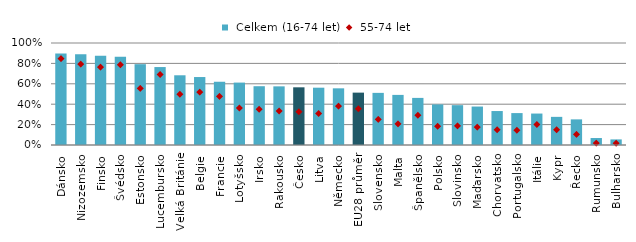
| Category |  Celkem (16-74 let) |
|---|---|
| Dánsko | 0.898 |
| Nizozemsko | 0.889 |
| Finsko | 0.874 |
| Švédsko | 0.865 |
| Estonsko | 0.792 |
| Lucembursko | 0.764 |
| Velká Británie | 0.684 |
| Belgie | 0.666 |
| Francie | 0.62 |
| Lotyšsko | 0.612 |
| Irsko | 0.576 |
| Rakousko | 0.575 |
| Česko | 0.566 |
| Litva | 0.562 |
| Německo | 0.556 |
| EU28 průměr | 0.513 |
| Slovensko | 0.511 |
| Malta | 0.491 |
| Španělsko | 0.462 |
| Polsko | 0.398 |
| Slovinsko | 0.391 |
| Maďarsko | 0.377 |
| Chorvatsko | 0.333 |
| Portugalsko | 0.313 |
| Itálie | 0.308 |
| Kypr | 0.276 |
| Řecko | 0.251 |
| Rumunsko | 0.068 |
| Bulharsko | 0.055 |